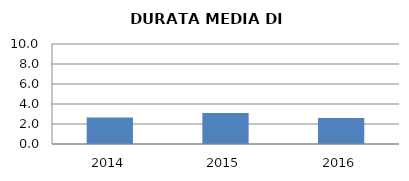
| Category | 2014 2015 2016 |
|---|---|
| 2014.0 | 2.659 |
| 2015.0 | 3.089 |
| 2016.0 | 2.6 |